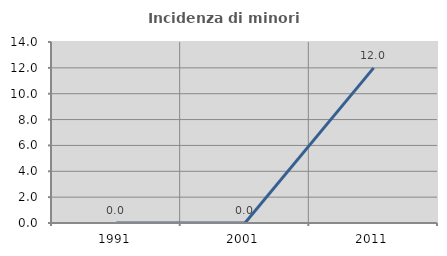
| Category | Incidenza di minori stranieri |
|---|---|
| 1991.0 | 0 |
| 2001.0 | 0 |
| 2011.0 | 12 |